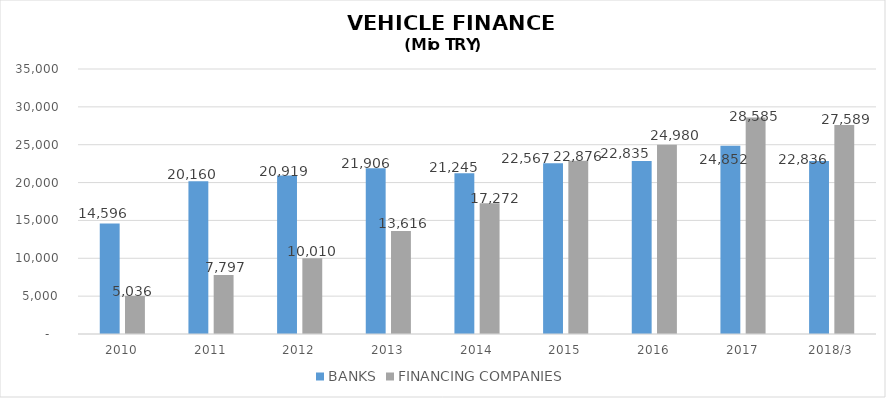
| Category | BANKS | FINANCING COMPANIES |
|---|---|---|
| 2010 | 14596 | 5035.89 |
| 2011 | 20160 | 7796.854 |
| 2012 | 20919 | 10009.755 |
| 2013 | 21906 | 13616.036 |
| 2014 | 21245 | 17271.844 |
| 2015 | 22567 | 22875.563 |
| 2016 | 22835 | 24980.231 |
| 2017 | 24852 | 28584.938 |
| 2018/3 | 22836 | 27588.785 |